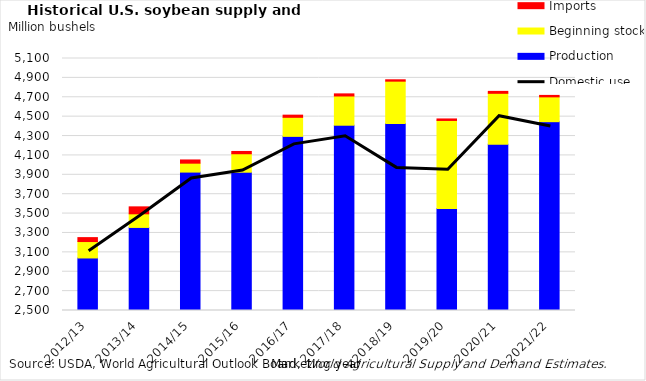
| Category | Production | Beginning stocks | Imports |
|---|---|---|---|
| 2012/13 | 3042.044 | 169.37 | 40.516 |
| 2013/14 | 3357.004 | 140.557 | 71.777 |
| 2014/15 | 3928.07 | 91.991 | 33.225 |
| 2015/16 | 3926.779 | 190.61 | 23.541 |
| 2016/17 | 4296.496 | 196.729 | 22.281 |
| 2017/18 | 4411.633 | 301.595 | 21.811 |
| 2018/19 | 4428.15 | 438.105 | 14.057 |
| 2019/20 | 3551.908 | 909.052 | 15.381 |
| 2020/21 | 4216.302 | 524.541 | 19.838 |
| 2021/22 | 4448.043 | 256.179 | 15 |